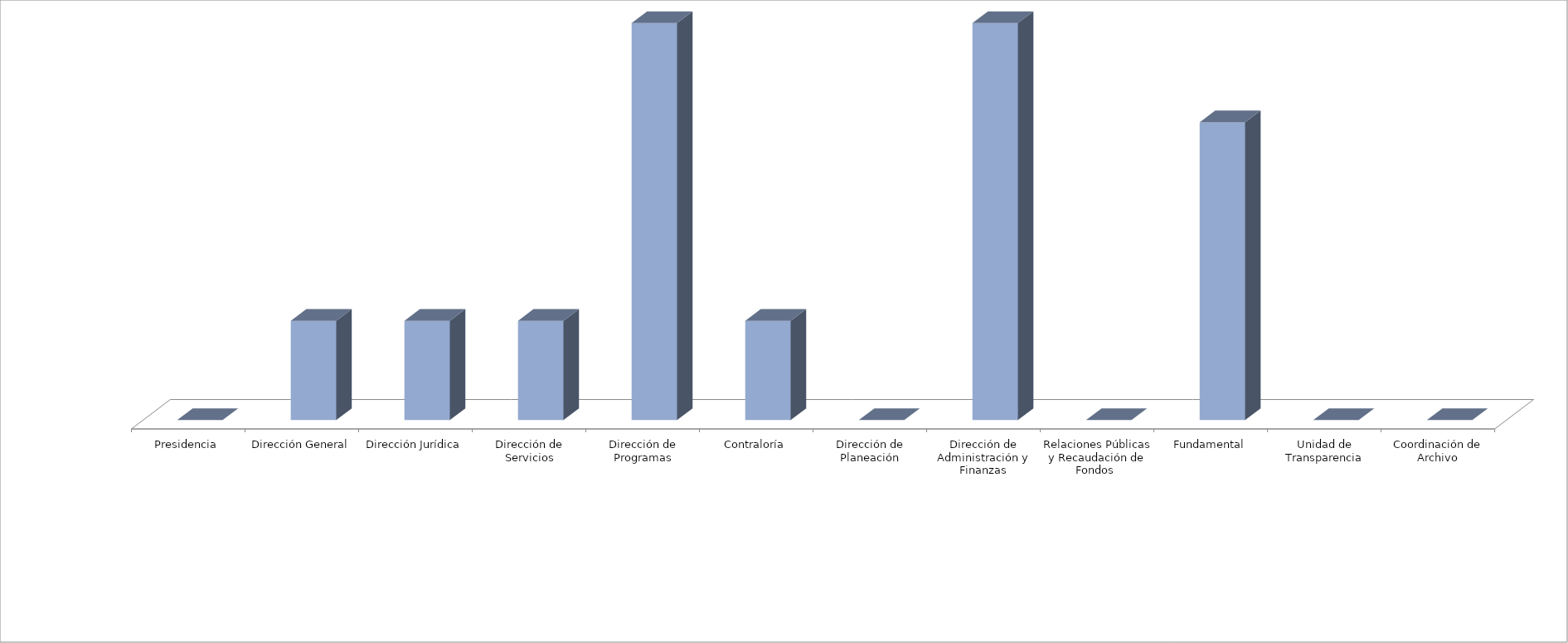
| Category | Series 0 | Series 1 |
|---|---|---|
| Presidencia |  | 0 |
| Dirección General |  | 1 |
| Dirección Jurídica |  | 1 |
| Dirección de Servicios |  | 1 |
| Dirección de Programas |  | 4 |
| Contraloría |  | 1 |
| Dirección de Planeación |  | 0 |
| Dirección de Administración y Finanzas |  | 4 |
| Relaciones Públicas y Recaudación de Fondos  |  | 0 |
| Fundamental |  | 3 |
| Unidad de Transparencia |  | 0 |
| Coordinación de Archivo |  | 0 |